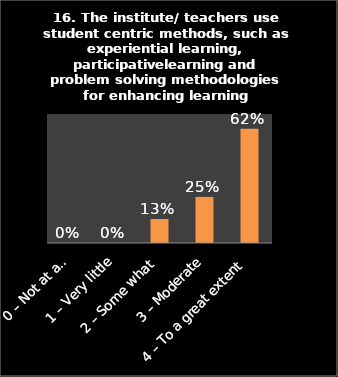
| Category | Series 0 |
|---|---|
| 0 – Not at all | 0 |
| 1 – Very little | 0 |
| 2 – Some what | 0.13 |
| 3 – Moderate | 0.25 |
| 4 – To a great extent | 0.62 |